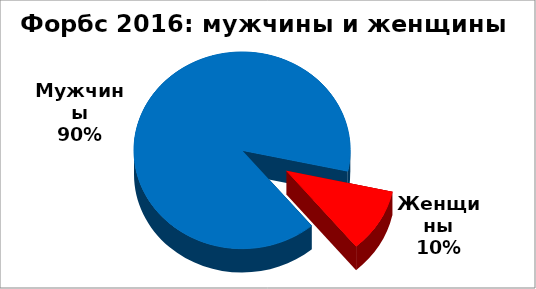
| Category | Series 0 |
|---|---|
| Мужчины | 1620 |
| Женщины | 190 |